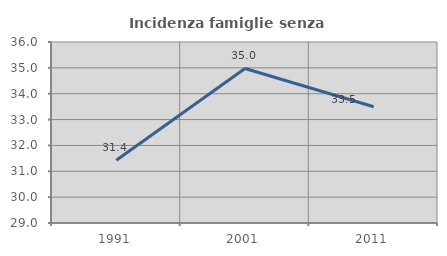
| Category | Incidenza famiglie senza nuclei |
|---|---|
| 1991.0 | 31.429 |
| 2001.0 | 34.975 |
| 2011.0 | 33.498 |